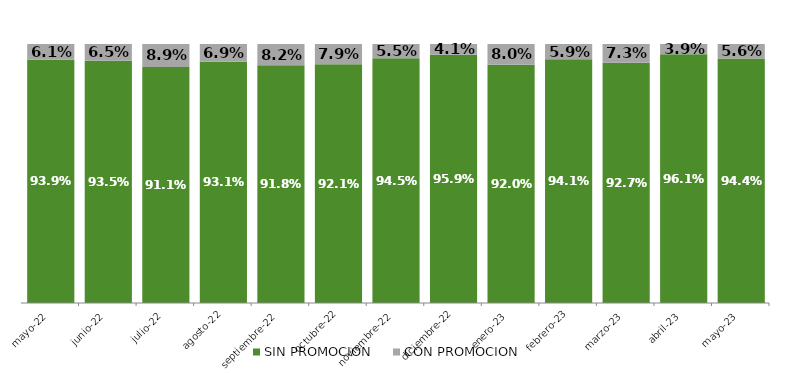
| Category | SIN PROMOCION   | CON PROMOCION   |
|---|---|---|
| 2022-05-01 | 0.939 | 0.061 |
| 2022-06-01 | 0.935 | 0.065 |
| 2022-07-01 | 0.911 | 0.089 |
| 2022-08-01 | 0.931 | 0.069 |
| 2022-09-01 | 0.918 | 0.082 |
| 2022-10-01 | 0.921 | 0.079 |
| 2022-11-01 | 0.945 | 0.055 |
| 2022-12-01 | 0.959 | 0.041 |
| 2023-01-01 | 0.92 | 0.08 |
| 2023-02-01 | 0.941 | 0.059 |
| 2023-03-01 | 0.927 | 0.073 |
| 2023-04-01 | 0.961 | 0.039 |
| 2023-05-01 | 0.944 | 0.056 |